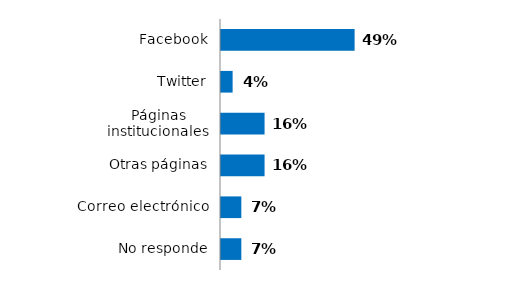
| Category | Series 0 |
|---|---|
| Facebook | 0.489 |
| Twitter | 0.043 |
| Páginas institucionales | 0.16 |
| Otras páginas | 0.16 |
| Correo electrónico | 0.074 |
| No responde | 0.074 |